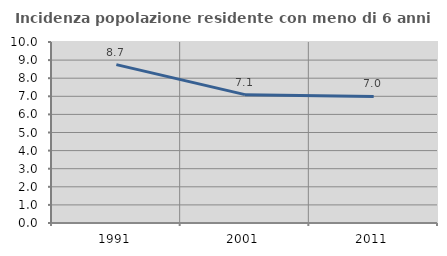
| Category | Incidenza popolazione residente con meno di 6 anni |
|---|---|
| 1991.0 | 8.748 |
| 2001.0 | 7.092 |
| 2011.0 | 6.991 |